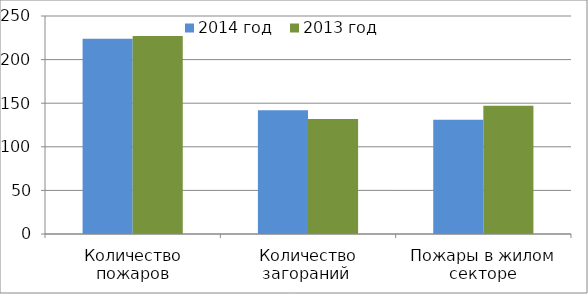
| Category | 2014 год | 2013 год |
|---|---|---|
| Количество пожаров | 224 | 227 |
| Количество загораний  | 142 | 132 |
| Пожары в жилом секторе | 131 | 147 |